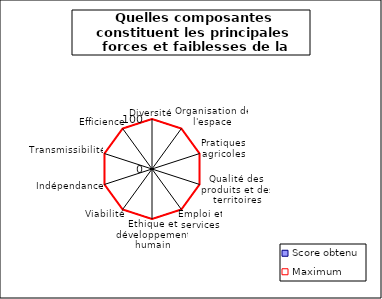
| Category | Score obtenu | Maximum |
|---|---|---|
| Diversité | 0 | 100 |
| Organisation de l'espace | 0 | 100 |
| Pratiques agricoles | 0 | 100 |
| Qualité des produits et des territoires | 0 | 100 |
| Emploi et services | 0 | 100 |
| Ethique et développement humain | 0 | 100 |
| Viabilité | 0 | 100 |
| Indépendance | 0 | 100 |
| Transmissibilité | 0 | 100 |
| Efficience | 0 | 100 |